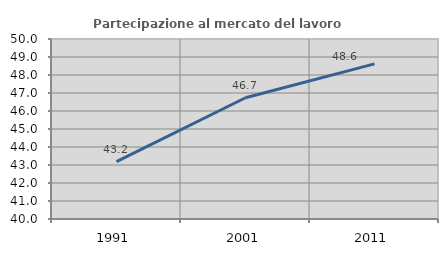
| Category | Partecipazione al mercato del lavoro  femminile |
|---|---|
| 1991.0 | 43.192 |
| 2001.0 | 46.737 |
| 2011.0 | 48.617 |